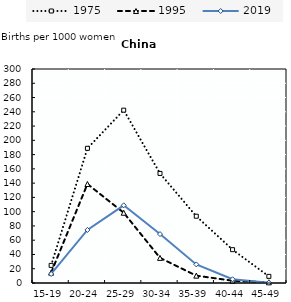
| Category | 1975 | 1995 | 2019 |
|---|---|---|---|
| 15-19 | 24.7 | 14.5 | 12.65 |
| 20-24 | 188.8 | 138.8 | 74.4 |
| 25-29 | 242.3 | 98.5 | 108.89 |
| 30-34 | 153.6 | 35.2 | 68.57 |
| 35-39 | 93.6 | 10.3 | 26.08 |
| 40-44 | 46.7 | 3.2 | 5.23 |
| 45-49 | 9.3 | 1 | 0.44 |